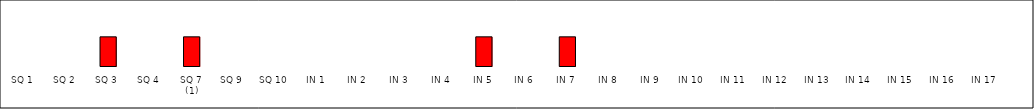
| Category | Series 0 |
|---|---|
| SQ 1 | 0 |
| SQ 2 | 0 |
| SQ 3 | 1 |
| SQ 4 | 0 |
| SQ 7 (1) | 1 |
| SQ 9 | 0 |
| SQ 10 | 0 |
| IN 1 | 0 |
| IN 2 | 0 |
| IN 3 | 0 |
| IN 4 | 0 |
| IN 5 | 1 |
| IN 6 | 0 |
| IN 7 | 1 |
| IN 8 | 0 |
| IN 9 | 0 |
| IN 10 | 0 |
| IN 11 | 0 |
| IN 12 | 0 |
| IN 13 | 0 |
| IN 14 | 0 |
| IN 15 | 0 |
| IN 16 | 0 |
| IN 17 | 0 |